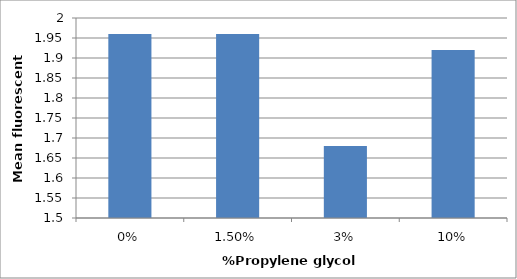
| Category | Series 0 |
|---|---|
| 0.0 | 1.96 |
| 0.015 | 1.96 |
| 0.03 | 1.68 |
| 0.1 | 1.92 |